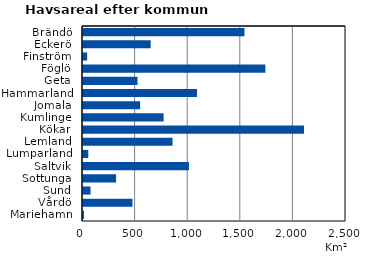
| Category | Series 0 |
|---|---|
| Brändö | 1534.76 |
| Eckerö | 643.47 |
| Finström | 39.53 |
| Föglö | 1733.5 |
| Geta | 518.18 |
| Hammarland | 1083.95 |
| Jomala | 543.07 |
| Kumlinge | 766.25 |
| Kökar | 2101.14 |
| Lemland | 851.2 |
| Lumparland | 50.5 |
| Saltvik | 1007.24 |
| Sottunga | 314.29 |
| Sund | 71.91 |
| Vårdö | 470.38 |
| Mariehamn | 8.93 |